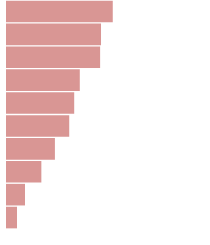
| Category | Series 0 |
|---|---|
| 0 | 10575863.66 |
| 1 | 9400767.698 |
| 2 | 9312350.4 |
| 3 | 7279323.755 |
| 4 | 6719375.773 |
| 5 | 6222575.773 |
| 6 | 4791131.83 |
| 7 | 3435385.8 |
| 8 | 1798191.924 |
| 9 | 1000456 |